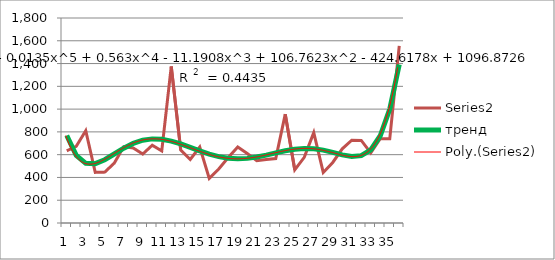
| Category | Series 1 | тренд |
|---|---|---|
| 0 | 633.648 | 768.376 |
| 1 | 673.572 | 593.743 |
| 2 | 810.372 | 524.137 |
| 3 | 444.42 | 521.181 |
| 4 | 446.736 | 555.561 |
| 5 | 525.54 | 605.717 |
| 6 | 669.96 | 656.623 |
| 7 | 658.572 | 698.659 |
| 8 | 605.65 | 726.57 |
| 9 | 682.777 | 738.52 |
| 10 | 633.019 | 735.229 |
| 11 | 1374.508 | 719.202 |
| 12 | 640.283 | 694.054 |
| 13 | 557.873 | 663.915 |
| 14 | 667.309 | 632.932 |
| 15 | 391.668 | 604.857 |
| 16 | 473.71 | 582.727 |
| 17 | 574.637 | 568.632 |
| 18 | 667.068 | 563.577 |
| 19 | 610.095 | 567.425 |
| 20 | 547.738 | 578.94 |
| 21 | 557.835 | 595.914 |
| 22 | 566.09 | 615.385 |
| 23 | 955.78 | 633.943 |
| 24 | 466.59 | 648.132 |
| 25 | 576.667 | 654.932 |
| 26 | 793.615 | 652.341 |
| 27 | 444.061 | 640.04 |
| 28 | 531.656 | 620.15 |
| 29 | 650.98 | 598.078 |
| 30 | 726.696 | 583.456 |
| 31 | 725.006 | 591.164 |
| 32 | 615.871 | 642.449 |
| 33 | 740.106 | 766.131 |
| 34 | 739.208 | 999.895 |
| 35 | 1554.95 | 1391.682 |